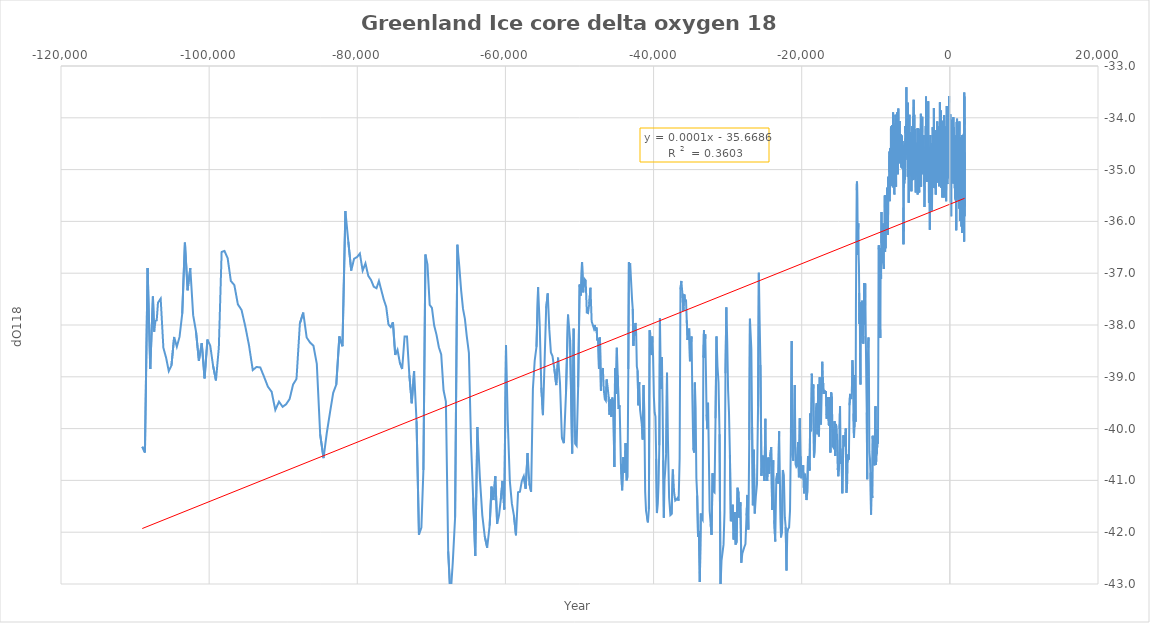
| Category | Series 0 |
|---|---|
| 1986.88 | -34.73 |
| 1983.99 | -35.9 |
| 1980.08 | -35.4 |
| 1976.37 | -34.67 |
| 1971.83 | -35 |
| 1967.33 | -34.2 |
| 1962.41 | -33.59 |
| 1957.62 | -35.71 |
| 1953.06 | -34.76 |
| 1947.75 | -34.71 |
| 1942.95 | -33.51 |
| 1938.21 | -34.13 |
| 1932.76 | -34.01 |
| 1927.46 | -36.39 |
| 1921.03 | -35.7 |
| 1915.12 | -35.98 |
| 1909.73 | -34.55 |
| 1903.32 | -34.94 |
| 1896.56 | -35.25 |
| 1890.69 | -34.96 |
| 1884.9 | -35.27 |
| 1878.68 | -34.34 |
| 1872.68 | -34.31 |
| 1865.9 | -35.35 |
| 1859.36 | -35.8 |
| 1853.17 | -34.61 |
| 1846.59 | -35.37 |
| 1839.08 | -35.62 |
| 1832.17 | -35.07 |
| 1826.73 | -34.93 |
| 1819.55 | -34.87 |
| 1811.43 | -35.44 |
| 1804.94 | -34.66 |
| 1797.57 | -35.22 |
| 1790.65 | -34.59 |
| 1783.79 | -35.5 |
| 1775.57 | -34.52 |
| 1768.16 | -35.05 |
| 1759.77 | -36.12 |
| 1752.74 | -35.09 |
| 1745.72 | -35.16 |
| 1737.3 | -35.62 |
| 1730.16 | -34.35 |
| 1722.77 | -35.94 |
| 1714.84 | -35.15 |
| 1706.74 | -35.31 |
| 1698.52 | -35.89 |
| 1691.22 | -35.09 |
| 1683.91 | -35.17 |
| 1676.8 | -34.66 |
| 1668.67 | -34.81 |
| 1660.0 | -34.82 |
| 1652.5 | -34.72 |
| 1645.0 | -36.22 |
| 1636.67 | -34.88 |
| 1629.67 | -35.29 |
| 1621.33 | -34.33 |
| 1613.67 | -35.26 |
| 1604.67 | -34.89 |
| 1597.0 | -35.23 |
| 1588.67 | -35.29 |
| 1581.0 | -34.9 |
| 1573.0 | -36.1 |
| 1564.0 | -34.75 |
| 1554.67 | -34.83 |
| 1546.5 | -35.23 |
| 1538.67 | -34.5 |
| 1530.67 | -35.14 |
| 1522.5 | -35.81 |
| 1512.67 | -35.05 |
| 1504.67 | -34.88 |
| 1497.0 | -34.71 |
| 1488.67 | -35.68 |
| 1479.75 | -35.59 |
| 1470.0 | -35.08 |
| 1460.33 | -34.57 |
| 1452.0 | -35.25 |
| 1443.5 | -34.93 |
| 1434.67 | -35.28 |
| 1427.0 | -34.62 |
| 1419.0 | -34.84 |
| 1410.67 | -34.38 |
| 1402.0 | -34.62 |
| 1393.5 | -35.28 |
| 1386.0 | -35.22 |
| 1377.33 | -34.75 |
| 1369.0 | -35.28 |
| 1361.0 | -35.99 |
| 1352.33 | -35.1 |
| 1343.67 | -35.26 |
| 1335.33 | -35.36 |
| 1326.67 | -35.11 |
| 1317.67 | -34.99 |
| 1309.33 | -34.99 |
| 1300.5 | -34.89 |
| 1291.5 | -35.49 |
| 1283.08 | -34.07 |
| 1274.37 | -34.95 |
| 1265.67 | -35.6 |
| 1256.8200000000002 | -34.46 |
| 1247.26 | -35.05 |
| 1238.9 | -35.75 |
| 1230.0 | -34.87 |
| 1219.8899999999999 | -34.67 |
| 1211.27 | -34.14 |
| 1201.1100000000001 | -35.36 |
| 1191.65 | -34.97 |
| 1182.7 | -35.12 |
| 1173.29 | -35.35 |
| 1163.45 | -35.6 |
| 1155.22 | -35.6 |
| 1146.22 | -34.51 |
| 1137.96 | -34.57 |
| 1130.04 | -34.27 |
| 1121.0 | -34.49 |
| 1112.47 | -35.23 |
| 1104.15 | -34.56 |
| 1095.5 | -35.12 |
| 1087.52 | -34.67 |
| 1077.9 | -35.01 |
| 1067.5700000000002 | -34.82 |
| 1060.27 | -35.2 |
| 1051.69 | -34.88 |
| 1043.21 | -35.03 |
| 1034.96 | -35.54 |
| 1025.05 | -34.57 |
| 1017.62 | -34.55 |
| 1008.96 | -34.85 |
| 1000.33 | -34.78 |
| 992.22 | -34.26 |
| 982.26 | -34.48 |
| 974.11 | -34.02 |
| 965.67 | -35.53 |
| 956.67 | -34.05 |
| 948.12 | -34.6 |
| 939.45 | -34.08 |
| 930.93 | -34.63 |
| 922.3900000000001 | -35.35 |
| 913.1600000000001 | -34.57 |
| 903.6800000000001 | -35.4 |
| 895.1700000000001 | -34.73 |
| 886.3299999999999 | -35.24 |
| 878.1500000000001 | -35.13 |
| 869.1500000000001 | -35.08 |
| 859.8699999999999 | -36.17 |
| 851.8199999999999 | -35.12 |
| 843.6400000000001 | -35.49 |
| 834.94 | -34.34 |
| 825.73 | -35.4 |
| 817.6800000000001 | -35.59 |
| 809.71 | -35.27 |
| 800.1500000000001 | -34.86 |
| 791.8199999999999 | -34.37 |
| 783.6199999999999 | -35.59 |
| 774.53 | -35.09 |
| 765.9100000000001 | -35.22 |
| 756.7 | -34.61 |
| 748.6800000000001 | -34.6 |
| 740.4300000000001 | -34.93 |
| 731.8800000000001 | -35.56 |
| 722.5899999999999 | -35.39 |
| 712.9000000000001 | -34.88 |
| 703.24 | -35.49 |
| 694.4300000000001 | -35.54 |
| 685.8299999999999 | -34.77 |
| 677.5999999999999 | -34.97 |
| 668.8900000000001 | -35.36 |
| 659.8499999999999 | -34.57 |
| 651.54 | -35.16 |
| 641.4300000000001 | -35.1 |
| 633.0 | -35.01 |
| 624.21 | -34.77 |
| 543.46 | -34.81 |
| 534.3199999999999 | -35.1 |
| 523.8499999999999 | -34.18 |
| 514.04 | -35.16 |
| 503.45000000000005 | -34.82 |
| 493.3699999999999 | -35.13 |
| 483.4100000000001 | -34.54 |
| 474.9200000000001 | -35.27 |
| 465.77 | -33.99 |
| 456.70000000000005 | -34.89 |
| 447.20000000000005 | -35.21 |
| 436.73 | -34.1 |
| 427.80999999999995 | -34.28 |
| 417.44000000000005 | -34.09 |
| 408.0999999999999 | -35.22 |
| 388.22 | -34.8 |
| 369.6199999999999 | -34.95 |
| 360.21000000000004 | -34.81 |
| 349.5 | -34.74 |
| 338.9100000000001 | -34.87 |
| 330.18000000000006 | -35.05 |
| 319.95000000000005 | -34.7 |
| 310.56999999999994 | -34.62 |
| 299.73 | -34.58 |
| 289.29999999999995 | -34.5 |
| 279.71000000000004 | -34.04 |
| 270.45000000000005 | -34.5 |
| 259.6400000000001 | -35.14 |
| 249.21000000000004 | -34.67 |
| 239.3699999999999 | -35.11 |
| 229.3599999999999 | -35.22 |
| 218.95000000000005 | -35.04 |
| 208.74 | -35.02 |
| 199.0 | -34.8 |
| 187.95000000000005 | -35.01 |
| 176.5 | -35.9 |
| 165.41000000000008 | -35.07 |
| 156.1099999999999 | -34.97 |
| 145.44000000000005 | -34.92 |
| 136.17000000000007 | -35.08 |
| 127.1099999999999 | -34.45 |
| 117.17000000000007 | -34.47 |
| 106.94000000000005 | -34.98 |
| 96.79999999999995 | -35.21 |
| 86.08999999999992 | -34.67 |
| 76.8900000000001 | -34.44 |
| 67.17000000000007 | -33.93 |
| 58.819999999999936 | -34.68 |
| 48.58999999999992 | -35.63 |
| 39.90000000000009 | -34.68 |
| 30.470000000000027 | -35.17 |
| 20.799999999999955 | -34.53 |
| 11.0 | -34.98 |
| 1.349999999999909 | -34.37 |
| -8.299999999999955 | -34.8 |
| -18.170000000000073 | -33.98 |
| -37.75 | -34.19 |
| -46.61999999999989 | -35.13 |
| -57.710000000000036 | -34.81 |
| -68.68000000000006 | -34.48 |
| -80.18000000000006 | -35.06 |
| -89.75 | -34.19 |
| -100.5 | -34.5 |
| -110.15999999999985 | -33.58 |
| -119.82000000000016 | -34.8 |
| -129.69999999999982 | -34.51 |
| -139.80999999999995 | -34.36 |
| -150.42999999999984 | -33.93 |
| -160.26999999999998 | -34.41 |
| -170.86000000000013 | -35.04 |
| -182.55999999999995 | -35.13 |
| -193.3800000000001 | -35.16 |
| -203.55000000000018 | -34.84 |
| -213.63999999999987 | -34.96 |
| -223.82999999999993 | -34.42 |
| -234.17000000000007 | -34.91 |
| -244.23999999999978 | -34.5 |
| -253.76000000000022 | -34.84 |
| -264.3000000000002 | -34.59 |
| -274.0 | -34.08 |
| -284.15999999999985 | -34.8 |
| -294.1500000000001 | -34.43 |
| -304.0 | -35.18 |
| -314.5500000000002 | -35.28 |
| -324.9000000000001 | -35.26 |
| -334.9499999999998 | -34.95 |
| -344.9499999999998 | -34.55 |
| -355.1100000000001 | -34.34 |
| -365.73 | -35.13 |
| -375.84000000000015 | -34.88 |
| -396.1999999999998 | -34.79 |
| -407.07000000000016 | -34.14 |
| -417.5799999999999 | -33.77 |
| -427.4499999999998 | -34.24 |
| -437.6100000000001 | -34.61 |
| -447.6300000000001 | -34.55 |
| -458.0999999999999 | -34.97 |
| -469.07000000000016 | -34.99 |
| -479.0 | -34.62 |
| -489.6700000000001 | -35.4 |
| -500.5799999999999 | -35.61 |
| -511.5 | -34.51 |
| -521.9000000000001 | -34.42 |
| -532.0799999999999 | -34.75 |
| -542.1500000000001 | -34.82 |
| -554.5300000000002 | -35.1 |
| -565.1300000000001 | -34.17 |
| -576.0 | -35.12 |
| -586.69 | -34.48 |
| -598.4499999999998 | -34.33 |
| -609.46 | -34.54 |
| -619.9499999999998 | -34.63 |
| -631.4000000000001 | -35.33 |
| -641.8899999999999 | -34.56 |
| -652.48 | -34.88 |
| -662.7600000000002 | -35.13 |
| -673.3899999999999 | -35.13 |
| -684.04 | -34.79 |
| -694.3499999999999 | -34.54 |
| -705.25 | -35.35 |
| -716.5500000000002 | -34.97 |
| -726.6999999999998 | -35.18 |
| -738.1999999999998 | -34.39 |
| -749.1700000000001 | -35.01 |
| -759.3600000000001 | -34.05 |
| -771.5300000000002 | -33.95 |
| -784.3200000000002 | -34.85 |
| -795.52 | -35.54 |
| -806.1399999999999 | -34.88 |
| -816.7399999999998 | -35.16 |
| -827.81 | -34.52 |
| -838.1399999999999 | -35.15 |
| -848.2600000000002 | -34.96 |
| -858.6999999999998 | -34.05 |
| -868.75 | -34.92 |
| -879.5300000000002 | -34.44 |
| -890.6300000000001 | -34.65 |
| -901.5999999999999 | -34.37 |
| -912.5 | -34.47 |
| -923.2600000000002 | -34.58 |
| -933.7800000000002 | -35.43 |
| -945.06 | -34.7 |
| -956.19 | -34.07 |
| -966.5 | -35.12 |
| -977.0500000000002 | -34.32 |
| -987.8000000000002 | -34.6 |
| -998.5900000000001 | -34.72 |
| -1010.23 | -34.88 |
| -1021.23 | -35.54 |
| -1032.81 | -35.14 |
| -1043.0 | -34.93 |
| -1054.0 | -34.73 |
| -1064.56 | -35.08 |
| -1075.44 | -34.44 |
| -1086.12 | -34.84 |
| -1097.1599999999999 | -34.95 |
| -1108.31 | -34.85 |
| -1120.4099999999999 | -34.26 |
| -1132.92 | -34.5 |
| -1145.6 | -34.82 |
| -1159.0 | -34.81 |
| -1170.17 | -35.35 |
| -1181.8899999999999 | -34.78 |
| -1194.15 | -33.86 |
| -1205.54 | -34.2 |
| -1217.4499999999998 | -34.29 |
| -1228.5700000000002 | -34.82 |
| -1238.5 | -34.78 |
| -1249.1399999999999 | -34.74 |
| -1260.9299999999998 | -34.42 |
| -1274.6799999999998 | -34.54 |
| -1286.71 | -34.36 |
| -1297.3899999999999 | -34.54 |
| -1309.0500000000002 | -34.61 |
| -1320.63 | -34.46 |
| -1332.44 | -34.09 |
| -1343.35 | -33.7 |
| -1355.4899999999998 | -34.5 |
| -1367.85 | -34.55 |
| -1379.4 | -34.33 |
| -1390.6999999999998 | -34.76 |
| -1403.0500000000002 | -35.03 |
| -1414.38 | -35.24 |
| -1426.5700000000002 | -35.2 |
| -1437.8200000000002 | -35.01 |
| -1449.88 | -35 |
| -1462.19 | -35.32 |
| -1498.4099999999999 | -34.9 |
| -1510.6799999999998 | -34.44 |
| -1522.9099999999999 | -34.91 |
| -1534.29 | -34.23 |
| -1546.5 | -34.16 |
| -1558.4 | -34.34 |
| -1569.4899999999998 | -34.65 |
| -1581.52 | -34.4 |
| -1593.9699999999998 | -35.25 |
| -1605.81 | -35.14 |
| -1618.1100000000001 | -34.68 |
| -1629.0 | -34.69 |
| -1640.56 | -34.18 |
| -1652.0300000000002 | -34.73 |
| -1665.2800000000002 | -34.63 |
| -1677.3200000000002 | -34.28 |
| -1689.3000000000002 | -35.1 |
| -1701.06 | -34.07 |
| -1713.9299999999998 | -34.65 |
| -1725.5900000000001 | -34.84 |
| -1736.7199999999998 | -34.56 |
| -1747.83 | -34.87 |
| -1760.0300000000002 | -34.88 |
| -1772.0700000000002 | -34.91 |
| -1784.5 | -35.11 |
| -1796.38 | -34.64 |
| -1808.1999999999998 | -34.24 |
| -1820.44 | -35.05 |
| -1832.6799999999998 | -34.41 |
| -1843.87 | -35.05 |
| -1855.92 | -34.93 |
| -1868.0900000000001 | -35.22 |
| -1880.56 | -34.33 |
| -1892.9099999999999 | -35.48 |
| -1905.1799999999998 | -34.92 |
| -1916.8200000000002 | -34.78 |
| -1928.8600000000001 | -35.36 |
| -1941.6 | -35.01 |
| -1953.94 | -34.37 |
| -1966.31 | -34.99 |
| -1979.1999999999998 | -35.21 |
| -1991.12 | -35.16 |
| -2003.5500000000002 | -34.92 |
| -2017.06 | -34.68 |
| -2029.4299999999998 | -34.61 |
| -2042.29 | -34.61 |
| -2054.45 | -34.24 |
| -2066.68 | -34.54 |
| -2080.21 | -35.18 |
| -2092.56 | -35.06 |
| -2104.94 | -34.63 |
| -2117.61 | -34.36 |
| -2130.64 | -35.35 |
| -2143.74 | -34.78 |
| -2155.8999999999996 | -33.81 |
| -2168.96 | -34.96 |
| -2182.1899999999996 | -34.4 |
| -2195.0 | -34.79 |
| -2207.5200000000004 | -35.02 |
| -2219.26 | -34.53 |
| -2231.8199999999997 | -34.76 |
| -2244.1499999999996 | -34.46 |
| -2256.6099999999997 | -34.7 |
| -2269.25 | -34.68 |
| -2281.6499999999996 | -34.93 |
| -2293.74 | -35.02 |
| -2307.38 | -34.18 |
| -2320.4700000000003 | -34.24 |
| -2332.6000000000004 | -34.54 |
| -2345.3199999999997 | -35 |
| -2357.3599999999997 | -34.69 |
| -2370.1400000000003 | -34.86 |
| -2383.33 | -34.59 |
| -2395.59 | -35.49 |
| -2409.0600000000004 | -35.79 |
| -2421.3599999999997 | -34.56 |
| -2434.2299999999996 | -35.41 |
| -2446.9399999999996 | -34.74 |
| -2460.21 | -34.79 |
| -2472.63 | -35.26 |
| -2485.4799999999996 | -34.49 |
| -2498.04 | -34.52 |
| -2510.3 | -35.76 |
| -2523.2200000000003 | -34.88 |
| -2536.16 | -34.75 |
| -2549.46 | -35.24 |
| -2562.88 | -34.53 |
| -2575.2700000000004 | -34.89 |
| -2588.3999999999996 | -34.87 |
| -2601.8900000000003 | -35.11 |
| -2615.08 | -34.58 |
| -2628.24 | -34.33 |
| -2640.8199999999997 | -34.9 |
| -2653.8999999999996 | -35.52 |
| -2667.1400000000003 | -35.11 |
| -2680.6800000000003 | -34.67 |
| -2693.45 | -36.09 |
| -2706.37 | -36.16 |
| -2719.83 | -34.57 |
| -2731.5600000000004 | -34.6 |
| -2744.3100000000004 | -34.95 |
| -2758.6400000000003 | -34.68 |
| -2771.16 | -34.61 |
| -2784.0 | -35.43 |
| -2797.3500000000004 | -35.32 |
| -2811.3599999999997 | -35.16 |
| -2824.13 | -35.64 |
| -2838.4700000000003 | -34.73 |
| -2851.8 | -34.61 |
| -2864.75 | -34.91 |
| -2878.16 | -34.97 |
| -2890.7 | -35.24 |
| -2904.0600000000004 | -34.53 |
| -2916.92 | -33.68 |
| -2930.1800000000003 | -34.76 |
| -2943.6899999999996 | -34.67 |
| -2956.79 | -34.52 |
| -2970.1099999999997 | -34.82 |
| -2983.2700000000004 | -33.96 |
| -2996.3 | -34.9 |
| -3009.17 | -34.66 |
| -3023.2700000000004 | -34.71 |
| -3037.5 | -35.09 |
| -3050.66 | -34.31 |
| -3065.09 | -35.04 |
| -3078.6499999999996 | -34.52 |
| -3091.6899999999996 | -34.21 |
| -3104.7 | -34.57 |
| -3119.84 | -35.18 |
| -3133.5600000000004 | -35.24 |
| -3147.29 | -34.73 |
| -3160.46 | -34.35 |
| -3175.04 | -34.22 |
| -3188.67 | -35.11 |
| -3202.71 | -34.78 |
| -3217.0600000000004 | -33.59 |
| -3230.66 | -34.74 |
| -3245.2 | -34.16 |
| -3259.7 | -34.51 |
| -3273.66 | -34.99 |
| -3287.8 | -34.56 |
| -3301.0 | -34.6 |
| -3329.5 | -35.04 |
| -3344.09 | -35.18 |
| -3359.08 | -34.88 |
| -3373.3900000000003 | -35.1 |
| -3388.08 | -34.89 |
| -3402.21 | -34.62 |
| -3416.0699999999997 | -35.4 |
| -3430.1899999999996 | -35.72 |
| -3443.63 | -35.16 |
| -3457.4300000000003 | -35.27 |
| -3471.9700000000003 | -34.66 |
| -3487.13 | -34.63 |
| -3501.33 | -34.65 |
| -3515.7299999999996 | -35.07 |
| -3530.3599999999997 | -34.33 |
| -3545.5600000000004 | -34.42 |
| -3560.8999999999996 | -34.51 |
| -3576.3599999999997 | -34.76 |
| -3590.71 | -34.51 |
| -3605.55 | -34.57 |
| -3620.6800000000003 | -34.63 |
| -3634.3100000000004 | -34.4 |
| -3649.67 | -34.97 |
| -3663.8100000000004 | -34.4 |
| -3679.8100000000004 | -34.49 |
| -3695.2 | -34.94 |
| -3710.13 | -34.83 |
| -3725.29 | -33.98 |
| -3742.1400000000003 | -34.84 |
| -3757.8900000000003 | -34.76 |
| -3773.8199999999997 | -34.71 |
| -3789.3199999999997 | -35.09 |
| -3805.71 | -34.67 |
| -3822.12 | -35.04 |
| -3837.1000000000004 | -34.35 |
| -3852.9399999999996 | -34.68 |
| -3868.46 | -34.83 |
| -3882.91 | -35.33 |
| -3898.8100000000004 | -34.75 |
| -3913.79 | -33.92 |
| -3929.0699999999997 | -34.96 |
| -3944.12 | -34.3 |
| -3959.0 | -34.94 |
| -3974.41 | -34.9 |
| -3989.3100000000004 | -34.51 |
| -4004.4300000000003 | -34.39 |
| -4019.75 | -34.69 |
| -4033.29 | -34.79 |
| -4048.5200000000004 | -34.44 |
| -4063.87 | -34.55 |
| -4079.62 | -34.97 |
| -4094.2 | -34.92 |
| -4110.24 | -35.03 |
| -4125.93 | -34.34 |
| -4142.18 | -35.44 |
| -4158.29 | -35.32 |
| -4174.5 | -34.75 |
| -4190.63 | -34.33 |
| -4205.0 | -34.69 |
| -4218.83 | -34.21 |
| -4234.88 | -35.18 |
| -4251.43 | -34.33 |
| -4266.86 | -35.04 |
| -4283.21 | -34.98 |
| -4299.88 | -35.08 |
| -4316.2 | -34.89 |
| -4332.33 | -35.13 |
| -4346.91 | -35.48 |
| -4363.36 | -34.2 |
| -4378.69 | -34.57 |
| -4394.4 | -34.72 |
| -4409.58 | -34.56 |
| -4425.14 | -35.05 |
| -4439.81 | -34.48 |
| -4456.5 | -34.54 |
| -4472.37 | -35.04 |
| -4488.12 | -35.13 |
| -4504.07 | -34.7 |
| -4519.71 | -34.71 |
| -4536.21 | -34.77 |
| -4552.0 | -34.53 |
| -4567.33 | -35.11 |
| -4583.77 | -34.79 |
| -4599.23 | -35.01 |
| -4614.13 | -35.44 |
| -4630.08 | -34.58 |
| -4646.04 | -34.59 |
| -4661.25 | -34.98 |
| -4677.08 | -35.19 |
| -4693.92 | -34.49 |
| -4709.05 | -34.22 |
| -4725.25 | -35.09 |
| -4741.64 | -34.91 |
| -4757.33 | -34.65 |
| -4774.3 | -34.83 |
| -4790.25 | -35.08 |
| -4807.26 | -33.94 |
| -4824.04 | -34.25 |
| -4840.67 | -34.24 |
| -4858.91 | -34.29 |
| -4875.29 | -33.79 |
| -4891.69 | -33.65 |
| -4908.26 | -34.9 |
| -4923.58 | -34.67 |
| -4940.17 | -33.97 |
| -4956.45 | -34.07 |
| -4972.73 | -34.31 |
| -4989.24 | -35.2 |
| -5006.25 | -34.2 |
| -5024.0 | -34.65 |
| -5040.59 | -35.02 |
| -5058.16 | -34.16 |
| -5075.08 | -34.83 |
| -5092.42 | -35.21 |
| -5110.1 | -35.15 |
| -5126.83 | -35.14 |
| -5144.28 | -34.9 |
| -5161.27 | -34.73 |
| -5178.21 | -34.66 |
| -5195.08 | -35.42 |
| -5211.5 | -34.29 |
| -5227.06 | -35.03 |
| -5245.32 | -34.73 |
| -5262.55 | -35.13 |
| -5279.61 | -35.02 |
| -5297.2 | -34.98 |
| -5315.5 | -34.95 |
| -5332.83 | -34.37 |
| -5349.06 | -35.03 |
| -5366.27 | -34.28 |
| -5383.96 | -34.29 |
| -5400.86 | -34.42 |
| -5417.52 | -34.99 |
| -5434.26 | -34.73 |
| -5451.25 | -33.94 |
| -5469.24 | -34.58 |
| -5485.32 | -34.42 |
| -5502.23 | -34.61 |
| -5519.42 | -34.61 |
| -5536.77 | -35 |
| -5554.37 | -35.64 |
| -5571.92 | -34.46 |
| -5590.25 | -34.89 |
| -5606.67 | -34.59 |
| -5623.11 | -34.39 |
| -5640.41 | -34.83 |
| -5657.36 | -33.71 |
| -5675.05 | -35.14 |
| -5693.04 | -34.4 |
| -5710.04 | -34.64 |
| -5728.27 | -34.24 |
| -5744.75 | -33.84 |
| -5761.95 | -34.57 |
| -5780.52 | -34.01 |
| -5797.83 | -34.45 |
| -5815.04 | -34.53 |
| -5832.1 | -34.37 |
| -5849.36 | -34.35 |
| -5865.85 | -33.41 |
| -5882.76 | -34.71 |
| -5901.36 | -34.12 |
| -5918.81 | -34.41 |
| -5936.05 | -34.7 |
| -5953.95 | -34.4 |
| -5972.17 | -34.81 |
| -5989.58 | -34.78 |
| -6008.71 | -34.16 |
| -6026.5 | -34.3 |
| -6043.32 | -34.57 |
| -6061.57 | -34.49 |
| -6080.42 | -35.19 |
| -6098.79 | -35.18 |
| -6115.92 | -34.77 |
| -6135.42 | -35.15 |
| -6150.29 | -34.73 |
| -6169.15 | -35.27 |
| -6186.0 | -34.92 |
| -6207.15 | -35.35 |
| -6225.64 | -36.19 |
| -6247.0 | -36.01 |
| -6265.360000000001 | -36.44 |
| -6285.23 | -35.73 |
| -6306.0 | -35.27 |
| -6326.629999999999 | -34.77 |
| -6345.799999999999 | -34.54 |
| -6362.92 | -34.73 |
| -6380.5 | -34.45 |
| -6400.33 | -34.83 |
| -6420.18 | -34.84 |
| -6438.92 | -34.98 |
| -6457.3099999999995 | -34.92 |
| -6477.6900000000005 | -34.34 |
| -6494.860000000001 | -34.85 |
| -6515.219999999999 | -34.6 |
| -6534.5 | -34.71 |
| -6554.709999999999 | -34.81 |
| -6573.83 | -34.96 |
| -6593.200000000001 | -34.86 |
| -6612.42 | -34.32 |
| -6629.33 | -34.49 |
| -6648.379999999999 | -34.54 |
| -6667.370000000001 | -34.54 |
| -6686.33 | -34.71 |
| -6704.620000000001 | -34.85 |
| -6723.17 | -34.4 |
| -6743.33 | -34.73 |
| -6763.219999999999 | -34.76 |
| -6781.5 | -34.06 |
| -6800.17 | -34.52 |
| -6818.43 | -34.68 |
| -6837.700000000001 | -34.31 |
| -6858.17 | -34.36 |
| -6879.0 | -34.88 |
| -6900.139999999999 | -34.79 |
| -6919.379999999999 | -34.23 |
| -6938.67 | -33.99 |
| -6957.6 | -33.82 |
| -6976.139999999999 | -34.58 |
| -6996.5599999999995 | -34.66 |
| -7017.139999999999 | -34.57 |
| -7037.33 | -35.09 |
| -7057.07 | -34.57 |
| -7077.67 | -34.46 |
| -7098.35 | -34.39 |
| -7116.860000000001 | -34.77 |
| -7135.8099999999995 | -33.9 |
| -7155.09 | -34.46 |
| -7173.860000000001 | -34.9 |
| -7194.0 | -34.9 |
| -7214.67 | -34.48 |
| -7233.219999999999 | -34.65 |
| -7254.73 | -35.33 |
| -7276.75 | -35.03 |
| -7298.0 | -34.6 |
| -7318.780000000001 | -35.07 |
| -7340.17 | -33.94 |
| -7362.83 | -34.19 |
| -7381.83 | -34.4 |
| -7403.780000000001 | -34.15 |
| -7424.0 | -34.89 |
| -7446.43 | -34.39 |
| -7467.700000000001 | -34.92 |
| -7488.780000000001 | -35.48 |
| -7509.4400000000005 | -35.13 |
| -7531.379999999999 | -35.28 |
| -7554.4400000000005 | -34.84 |
| -7578.200000000001 | -35.09 |
| -7600.629999999999 | -34.4 |
| -7623.790000000001 | -34.64 |
| -7645.889999999999 | -34.78 |
| -7669.450000000001 | -33.9 |
| -7693.32 | -35.34 |
| -7714.950000000001 | -34.28 |
| -7740.41 | -34.21 |
| -7763.219999999999 | -34.48 |
| -7785.620000000001 | -35.23 |
| -7809.5 | -34.14 |
| -7833.3099999999995 | -34.57 |
| -7856.889999999999 | -35.31 |
| -7878.67 | -35.07 |
| -7902.23 | -35.04 |
| -7923.889999999999 | -34.86 |
| -7949.049999999999 | -34.17 |
| -7970.42 | -35.17 |
| -7995.360000000001 | -34.9 |
| -8018.58 | -34.62 |
| -8040.42 | -35.17 |
| -8064.200000000001 | -34.59 |
| -8088.0 | -35.45 |
| -8111.5 | -35.61 |
| -8134.5 | -35.57 |
| -8159.4 | -34.65 |
| -8184.799999999999 | -35.05 |
| -8211.1 | -35.4 |
| -8237.5 | -35.46 |
| -8264.1 | -35.16 |
| -8288.1 | -35.33 |
| -8312.1 | -35.14 |
| -8335.8 | -35.87 |
| -8362.2 | -36.26 |
| -8389.5 | -35.83 |
| -8413.6 | -35.83 |
| -8440.0 | -35.87 |
| -8464.8 | -35.35 |
| -8493.3 | -35.38 |
| -8521.0 | -36 |
| -8549.0 | -35.69 |
| -8577.0 | -35.51 |
| -8605.0 | -36.05 |
| -8632.0 | -35.65 |
| -8660.0 | -35.49 |
| -8690.0 | -36.52 |
| -8718.0 | -35.61 |
| -8746.0 | -36.59 |
| -8774.0 | -35.5 |
| -8804.0 | -35.99 |
| -8831.0 | -35.99 |
| -8859.0 | -36.13 |
| -8889.0 | -36.24 |
| -8918.0 | -36.92 |
| -8949.0 | -36.82 |
| -8977.0 | -36.52 |
| -9007.0 | -36.04 |
| -9037.0 | -36.53 |
| -9069.0 | -36.4 |
| -9099.0 | -36.67 |
| -9132.0 | -36.56 |
| -9161.0 | -36.81 |
| -9192.0 | -36.76 |
| -9225.0 | -35.82 |
| -9255.0 | -36.42 |
| -9286.0 | -37.11 |
| -9319.0 | -36.52 |
| -9351.0 | -37.09 |
| -9383.0 | -38.25 |
| -9420.0 | -38.05 |
| -9458.0 | -37.05 |
| -9491.0 | -37.39 |
| -9524.0 | -36.77 |
| -9554.0 | -36.57 |
| -9588.0 | -36.46 |
| -9623.0 | -36.54 |
| -9659.0 | -38.72 |
| -9702.0 | -40.29 |
| -9767.0 | -40.01 |
| -9835.0 | -40.48 |
| -9901.0 | -40.45 |
| -9971.0 | -40.7 |
| -10041.0 | -39.57 |
| -10116.0 | -40.14 |
| -10186.0 | -40.71 |
| -10258.0 | -40.3 |
| -10334.0 | -40.36 |
| -10413.0 | -40.14 |
| -10487.0 | -41.34 |
| -10562.0 | -40.84 |
| -10640.0 | -41.66 |
| -10717.0 | -40.85 |
| -10791.0 | -40.58 |
| -10866.0 | -40.45 |
| -10932.0 | -38.76 |
| -10985.0 | -38.24 |
| -11026.0 | -38.44 |
| -11067.0 | -38.63 |
| -11114.0 | -39.27 |
| -11157.0 | -40.98 |
| -11217.0 | -39.69 |
| -11274.0 | -39.15 |
| -11328.0 | -38.46 |
| -11378.0 | -38.46 |
| -11428.0 | -37.2 |
| -11472.0 | -38 |
| -11516.0 | -37.81 |
| -11559.0 | -37.19 |
| -11600.0 | -37.61 |
| -11637.0 | -38.18 |
| -11684.0 | -38.36 |
| -11732.0 | -38.07 |
| -11774.0 | -37.8 |
| -11814.0 | -37.91 |
| -11853.0 | -37.53 |
| -11894.0 | -38.13 |
| -11936.0 | -38.19 |
| -11981.0 | -37.67 |
| -12022.0 | -38.35 |
| -12063.0 | -39.15 |
| -12122.0 | -38.54 |
| -12164.0 | -37.56 |
| -12199.0 | -37.98 |
| -12237.0 | -37.38 |
| -12273.0 | -36.87 |
| -12311.0 | -36.67 |
| -12346.0 | -36.04 |
| -12381.0 | -36.11 |
| -12413.0 | -36.65 |
| -12448.0 | -36.18 |
| -12482.0 | -35.56 |
| -12512.0 | -35.3 |
| -12544.0 | -35.23 |
| -12577.0 | -35.4 |
| -12608.0 | -36 |
| -12641.0 | -36.66 |
| -12681.0 | -37.63 |
| -12723.0 | -39.87 |
| -12800.0 | -38.97 |
| -12872.0 | -39.97 |
| -12944.0 | -40.18 |
| -13013.0 | -39.71 |
| -13086.0 | -38.82 |
| -13154.0 | -38.68 |
| -13226.0 | -39.29 |
| -13304.0 | -39.43 |
| -13387.0 | -39.39 |
| -13472.0 | -39.33 |
| -13547.0 | -39.55 |
| -13630.0 | -40.6 |
| -13712.0 | -40.5 |
| -13796.0 | -40.63 |
| -13879.0 | -41.13 |
| -13958.0 | -41.24 |
| -14045.0 | -40 |
| -14127.0 | -40.2 |
| -14211.0 | -40.16 |
| -14286.0 | -40.34 |
| -14360.0 | -40.13 |
| -14441.0 | -40.12 |
| -14522.0 | -41.25 |
| -14603.0 | -40.63 |
| -14674.0 | -40.68 |
| -14752.0 | -40.38 |
| -14825.0 | -39.57 |
| -14897.0 | -40.01 |
| -14972.0 | -40.81 |
| -15054.0 | -40.92 |
| -15139.0 | -40.76 |
| -15223.0 | -40.19 |
| -15296.0 | -39.97 |
| -15386.0 | -39.91 |
| -15470.0 | -40.53 |
| -15560.0 | -39.86 |
| -15650.0 | -40.22 |
| -15742.0 | -40.36 |
| -15833.0 | -40.34 |
| -15932.0 | -39.34 |
| -16031.0 | -39.3 |
| -16128.0 | -40.46 |
| -16228.0 | -39.39 |
| -16329.0 | -39.94 |
| -16420.0 | -39.72 |
| -16526.0 | -39.39 |
| -16622.0 | -39.81 |
| -16727.0 | -39.28 |
| -16831.0 | -39.33 |
| -16939.0 | -39.26 |
| -17045.0 | -39.33 |
| -17138.0 | -39.02 |
| -17222.0 | -38.71 |
| -17305.0 | -39.29 |
| -17394.0 | -39.92 |
| -17478.0 | -39.62 |
| -17572.0 | -39.01 |
| -17670.0 | -40.15 |
| -17773.0 | -39.15 |
| -17870.0 | -40.11 |
| -17966.0 | -39.51 |
| -18063.0 | -39.63 |
| -18156.0 | -39.98 |
| -18245.0 | -40.45 |
| -18343.0 | -40.56 |
| -18437.0 | -39.15 |
| -18538.0 | -39.49 |
| -18633.0 | -38.94 |
| -18733.0 | -40.05 |
| -18842.0 | -39.71 |
| -18938.0 | -40.81 |
| -19048.0 | -40.56 |
| -19149.0 | -40.53 |
| -19251.0 | -41.24 |
| -19357.0 | -41.38 |
| -19461.0 | -40.96 |
| -19568.0 | -40.87 |
| -19683.0 | -41.25 |
| -19805.0 | -40.71 |
| -19928.0 | -40.76 |
| -20047.5 | -40.96 |
| -20150.5 | -40.53 |
| -20263.5 | -39.8 |
| -20371.5 | -40.94 |
| -20493.0 | -40.26 |
| -20607.0 | -40.72 |
| -20719.0 | -40.74 |
| -20827.0 | -40.69 |
| -20938.0 | -39.16 |
| -21040.0 | -40.36 |
| -21145.0 | -40.62 |
| -21259.0 | -40.48 |
| -21353.0 | -38.31 |
| -21456.0 | -40.08 |
| -21578.0 | -41.58 |
| -21706.0 | -41.91 |
| -21826.0 | -41.93 |
| -21946.0 | -42.02 |
| -22050.0 | -42.74 |
| -22165.0 | -41.9 |
| -22279.0 | -41.71 |
| -22413.0 | -40.9 |
| -22543.0 | -40.8 |
| -22665.0 | -42.01 |
| -22792.0 | -42.1 |
| -22922.0 | -41.18 |
| -23049.0 | -40.05 |
| -23176.0 | -41.06 |
| -23306.0 | -40.86 |
| -23438.0 | -41.01 |
| -23575.0 | -42.18 |
| -23712.0 | -41.77 |
| -23843.0 | -40.61 |
| -23985.0 | -41.57 |
| -24122.0 | -40.36 |
| -24254.0 | -40.53 |
| -24386.0 | -40.87 |
| -24525.0 | -40.56 |
| -24659.0 | -41.01 |
| -24780.0 | -40.85 |
| -24904.0 | -39.81 |
| -25030.0 | -41.01 |
| -25157.0 | -40.57 |
| -25289.0 | -40.52 |
| -25431.0 | -40.91 |
| -25571.0 | -38.77 |
| -25683.0 | -37.91 |
| -25786.0 | -36.99 |
| -25894.0 | -39.57 |
| -26037.0 | -41.07 |
| -26193.0 | -41.31 |
| -26337.0 | -41.64 |
| -26467.0 | -40.41 |
| -26590.0 | -41.48 |
| -26699.0 | -39.97 |
| -26801.0 | -38.46 |
| -26893.0 | -38.18 |
| -26991.0 | -37.88 |
| -27083.0 | -40.22 |
| -27199.0 | -41.95 |
| -27327.0 | -41.28 |
| -27449.0 | -41.68 |
| -27598.0 | -42.23 |
| -27756.0 | -42.29 |
| -27890.0 | -42.35 |
| -28017.0 | -42.41 |
| -28152.0 | -42.59 |
| -28283.0 | -41.42 |
| -28413.0 | -41.72 |
| -28548.0 | -41.22 |
| -28669.0 | -41.14 |
| -28795.0 | -42.2 |
| -28926.0 | -42.24 |
| -29058.0 | -41.61 |
| -29190.0 | -42.14 |
| -29317.0 | -41.47 |
| -29445.0 | -41.75 |
| -29571.0 | -41.79 |
| -29693.0 | -40.51 |
| -29818.0 | -39.69 |
| -29938.0 | -39.26 |
| -30053.0 | -38.35 |
| -30173.0 | -37.66 |
| -30295.0 | -38.93 |
| -30422.0 | -41.61 |
| -30556.0 | -42.24 |
| -30688.0 | -42.23 |
| -30827.0 | -42.55 |
| -30963.0 | -43.05 |
| -31094.0 | -40.11 |
| -31232.0 | -39.11 |
| -31369.0 | -38.8 |
| -31505.0 | -38.22 |
| -31637.0 | -39.8 |
| -31771.0 | -41.23 |
| -31906.0 | -41.21 |
| -32038.0 | -40.86 |
| -32170.0 | -42.05 |
| -32296.0 | -41.84 |
| -32427.0 | -41.59 |
| -32546.0 | -40.43 |
| -32641.0 | -39.5 |
| -32745.0 | -40.01 |
| -32842.0 | -39.73 |
| -32934.0 | -38.88 |
| -33022.0 | -38.18 |
| -33112.0 | -38.63 |
| -33197.0 | -38.1 |
| -33282.0 | -38.63 |
| -33374.0 | -41.76 |
| -33497.0 | -41.73 |
| -33621.0 | -41.64 |
| -33756.0 | -42.96 |
| -33877.0 | -41.98 |
| -33993.0 | -42.09 |
| -34111.0 | -41.29 |
| -34221.0 | -40.96 |
| -34324.0 | -39.6 |
| -34426.0 | -39.11 |
| -34531.0 | -40.46 |
| -34641.0 | -40.37 |
| -34759.0 | -39.43 |
| -34872.0 | -38.22 |
| -34977.0 | -38.41 |
| -35085.0 | -38.7 |
| -35193.0 | -38.07 |
| -35297.0 | -38.06 |
| -35409.0 | -38.29 |
| -35519.0 | -37.91 |
| -35624.0 | -37.51 |
| -35734.0 | -37.55 |
| -35854.0 | -37.41 |
| -35980.0 | -37.73 |
| -36112.0 | -37.39 |
| -36251.0 | -37.15 |
| -36370.0 | -37.31 |
| -36482.0 | -40.58 |
| -36615.0 | -41.39 |
| -36761.0 | -41.34 |
| -36921.0 | -41.37 |
| -37076.0 | -41.39 |
| -37233.0 | -41.22 |
| -37397.0 | -40.79 |
| -37563.0 | -41.65 |
| -37728.0 | -41.67 |
| -37902.0 | -41.33 |
| -38056.0 | -40.24 |
| -38184.0 | -38.92 |
| -38300.0 | -40.47 |
| -38421.0 | -40.79 |
| -38518.0 | -40.99 |
| -38612.0 | -41.72 |
| -38699.0 | -40.61 |
| -38787.0 | -39.47 |
| -38873.0 | -38.62 |
| -38966.0 | -39.23 |
| -39059.0 | -38.67 |
| -39141.0 | -37.87 |
| -39222.0 | -40.32 |
| -39324.0 | -41.04 |
| -39431.0 | -41.45 |
| -39547.0 | -41.63 |
| -39646.0 | -40.58 |
| -39745.0 | -39.77 |
| -39852.0 | -39.69 |
| -39958.0 | -39.39 |
| -40064.0 | -38.61 |
| -40165.0 | -38.22 |
| -40258.0 | -38.58 |
| -40359.0 | -38.5 |
| -40443.0 | -38.16 |
| -40536.0 | -38.1 |
| -40631.0 | -41.55 |
| -40763.0 | -41.81 |
| -40889.0 | -41.7 |
| -41017.0 | -41.59 |
| -41135.0 | -41.22 |
| -41253.0 | -39.63 |
| -41355.0 | -39.16 |
| -41463.0 | -40.21 |
| -41582.0 | -39.93 |
| -41699.0 | -39.94 |
| -41820.0 | -39.64 |
| -41937.0 | -39.1 |
| -42053.0 | -39.55 |
| -42161.0 | -38.88 |
| -42260.0 | -38.8 |
| -42349.0 | -38.16 |
| -42443.0 | -37.96 |
| -42542.0 | -38.2 |
| -42633.0 | -38.13 |
| -42726.0 | -38.4 |
| -42811.0 | -37.69 |
| -42900.0 | -37.52 |
| -42991.0 | -37.27 |
| -43078.0 | -37.27 |
| -43157.0 | -36.81 |
| -43247.0 | -36.91 |
| -43333.0 | -36.79 |
| -43410.0 | -38.85 |
| -43512.0 | -40.93 |
| -43635.0 | -41 |
| -43771.0 | -40.28 |
| -43909.0 | -40.85 |
| -44074.0 | -40.55 |
| -44244.0 | -41.19 |
| -44413.0 | -40.68 |
| -44581.0 | -39.55 |
| -44714.0 | -39.62 |
| -44838.0 | -38.97 |
| -44961.0 | -38.44 |
| -45076.0 | -39.33 |
| -45196.0 | -38.83 |
| -45295.0 | -40.74 |
| -45441.0 | -39.48 |
| -45579.0 | -39.4 |
| -45699.0 | -39.77 |
| -45817.0 | -39.44 |
| -45942.0 | -39.73 |
| -46071.0 | -39.38 |
| -46201.0 | -39.2 |
| -46329.0 | -39.05 |
| -46450.0 | -39.46 |
| -46582.0 | -39.43 |
| -46721.0 | -39.25 |
| -46845.0 | -38.83 |
| -46976.0 | -38.91 |
| -47107.0 | -39.27 |
| -47240.0 | -38.24 |
| -47370.0 | -38.85 |
| -47482.0 | -38.26 |
| -47591.0 | -38.3 |
| -47702.0 | -38.05 |
| -47818.0 | -38.11 |
| -47934.0 | -38 |
| -48052.0 | -38.07 |
| -48357.5 | -37.93 |
| -48520.0 | -37.28 |
| -48682.6 | -37.59 |
| -48845.1 | -37.77 |
| -49007.7 | -37.76 |
| -49170.2 | -37.14 |
| -49332.8 | -37.11 |
| -49495.3 | -37.37 |
| -49657.9 | -36.79 |
| -49820.4 | -37.43 |
| -49983.0 | -37.22 |
| -50184.7 | -39.2 |
| -50386.4 | -40.33 |
| -50588.1 | -40.29 |
| -50789.8 | -38.07 |
| -50991.5 | -40.48 |
| -51269.3 | -38.29 |
| -51547.2 | -37.8 |
| -51825.1 | -39.32 |
| -52102.9 | -40.28 |
| -52380.8 | -40.17 |
| -52634.0 | -39.12 |
| -52887.3 | -38.63 |
| -53140.5 | -39.16 |
| -53393.8 | -38.85 |
| -53647.0 | -38.6 |
| -53860.6 | -38.53 |
| -54074.2 | -38.09 |
| -54287.8 | -37.39 |
| -54501.4 | -37.68 |
| -54715.0 | -38.72 |
| -54933.6 | -39.74 |
| -55152.2 | -39.21 |
| -55370.8 | -38.01 |
| -55589.4 | -37.27 |
| -55808.0 | -38.42 |
| -56048.8 | -38.69 |
| -56289.6 | -39.23 |
| -56530.4 | -41.22 |
| -56771.2 | -41.06 |
| -57012.0 | -40.47 |
| -57269.0 | -41.16 |
| -57526.0 | -40.92 |
| -57783.0 | -41.01 |
| -58040.0 | -41.22 |
| -58297.0 | -41.23 |
| -58574.4 | -42.06 |
| -58851.8 | -41.68 |
| -59129.2 | -41.45 |
| -59406.6 | -41.01 |
| -59684.0 | -39.86 |
| -59919.8 | -38.39 |
| -60155.6 | -41.56 |
| -60391.4 | -41.01 |
| -60627.2 | -41.37 |
| -60863.0 | -41.67 |
| -61116.4 | -41.84 |
| -61369.8 | -40.92 |
| -61623.2 | -41.38 |
| -61876.6 | -41.12 |
| -62130.0 | -41.87 |
| -62461.2 | -42.3 |
| -62792.4 | -42.08 |
| -63123.6 | -41.67 |
| -63454.8 | -40.94 |
| -63786.0 | -39.97 |
| -64072.2 | -42.46 |
| -64358.399999999994 | -41.33 |
| -64644.600000000006 | -40.27 |
| -64930.8 | -38.54 |
| -65217.0 | -38.22 |
| -65471.0 | -37.88 |
| -65725.0 | -37.69 |
| -65979.0 | -37.33 |
| -66233.0 | -36.86 |
| -66487.0 | -36.45 |
| -66797.2 | -41.72 |
| -67107.4 | -42.58 |
| -67417.6 | -43.26 |
| -67727.8 | -42.37 |
| -68038.0 | -39.48 |
| -68354.2 | -39.26 |
| -68670.4 | -38.57 |
| -68986.6 | -38.43 |
| -69302.8 | -38.19 |
| -69619.0 | -38.01 |
| -69922.0 | -37.67 |
| -70225.0 | -37.61 |
| -70528.0 | -36.83 |
| -70800.7 | -36.64 |
| -71073.3 | -40.8 |
| -71346.0 | -41.91 |
| -71673.3 | -42.05 |
| -72000.7 | -39.86 |
| -72328.0 | -38.89 |
| -72648.3 | -39.51 |
| -72968.7 | -38.97 |
| -73289.0 | -38.22 |
| -73614.0 | -38.22 |
| -73939.0 | -38.85 |
| -74264.0 | -38.72 |
| -74571.0 | -38.48 |
| -74878.0 | -38.58 |
| -75185.0 | -37.95 |
| -75488.3 | -38.04 |
| -75791.7 | -37.99 |
| -76095.0 | -37.65 |
| -76422.8 | -37.51 |
| -76750.5 | -37.33 |
| -77078.3 | -37.15 |
| -77406.0 | -37.29 |
| -77776.7 | -37.26 |
| -78147.3 | -37.13 |
| -78518.0 | -37.05 |
| -78896.3 | -36.81 |
| -79274.7 | -36.95 |
| -79653.0 | -36.62 |
| -80041.0 | -36.69 |
| -80429.0 | -36.72 |
| -80817.0 | -36.95 |
| -81211.7 | -36.39 |
| -81606.3 | -35.8 |
| -82001.0 | -38.41 |
| -82418.0 | -38.22 |
| -82835.0 | -39.15 |
| -83252.0 | -39.31 |
| -83687.3 | -39.69 |
| -84122.7 | -40.09 |
| -84558.0 | -40.57 |
| -85011.3 | -40.11 |
| -85464.7 | -38.75 |
| -85918.0 | -38.4 |
| -86376.7 | -38.34 |
| -86835.3 | -38.24 |
| -87294.0 | -37.76 |
| -87750.0 | -37.97 |
| -88206.0 | -39.04 |
| -88668.4 | -39.15 |
| -89137.3 | -39.43 |
| -89606.1 | -39.53 |
| -90075.0 | -39.58 |
| -90570.0 | -39.48 |
| -91065.0 | -39.64 |
| -91560.0 | -39.29 |
| -92071.3 | -39.19 |
| -92582.7 | -39 |
| -93094.0 | -38.82 |
| -93603.0 | -38.81 |
| -94112.0 | -38.87 |
| -94621.0 | -38.39 |
| -95130.0 | -38.02 |
| -95626.5 | -37.71 |
| -96123.0 | -37.6 |
| -96596.0 | -37.23 |
| -97069.0 | -37.15 |
| -97501.0 | -36.71 |
| -97933.0 | -36.57 |
| -98313.0 | -36.59 |
| -98693.0 | -38.44 |
| -99080.0 | -39.07 |
| -99467.0 | -38.79 |
| -99849.5 | -38.4 |
| -100232.0 | -38.28 |
| -100614.5 | -39.03 |
| -100997.0 | -38.35 |
| -101384.0 | -38.69 |
| -101771.0 | -38.13 |
| -102158.0 | -37.81 |
| -102545.0 | -36.9 |
| -102908.0 | -37.33 |
| -103271.0 | -36.41 |
| -103634.0 | -37.78 |
| -103997.0 | -38.23 |
| -104360.3 | -38.42 |
| -104723.5 | -38.23 |
| -105086.8 | -38.78 |
| -105450.0 | -38.89 |
| -105814.3 | -38.63 |
| -106178.5 | -38.44 |
| -106542.8 | -37.49 |
| -106907.0 | -37.57 |
| -107077.8 | -37.91 |
| -107248.5 | -37.92 |
| -107419.3 | -38.13 |
| -107590.0 | -37.45 |
| -107949.3 | -38.85 |
| -108308.5 | -36.9 |
| -108667.8 | -40.46 |
| -109027.0 | -40.35 |